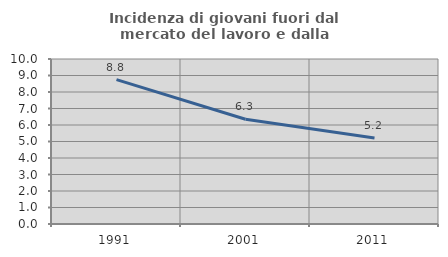
| Category | Incidenza di giovani fuori dal mercato del lavoro e dalla formazione  |
|---|---|
| 1991.0 | 8.75 |
| 2001.0 | 6.349 |
| 2011.0 | 5.217 |